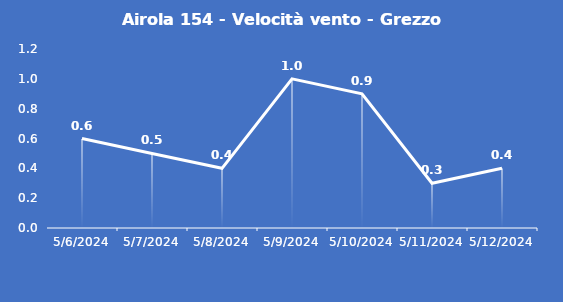
| Category | Airola 154 - Velocità vento - Grezzo (m/s) |
|---|---|
| 5/6/24 | 0.6 |
| 5/7/24 | 0.5 |
| 5/8/24 | 0.4 |
| 5/9/24 | 1 |
| 5/10/24 | 0.9 |
| 5/11/24 | 0.3 |
| 5/12/24 | 0.4 |